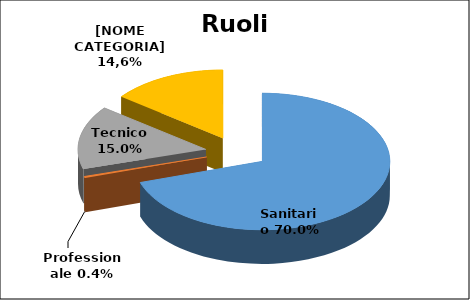
| Category | Series 0 |
|---|---|
| Sanitario | 0.7 |
| Professionale | 0.004 |
| Tecnico | 0.15 |
| Amministrativo | 0.146 |